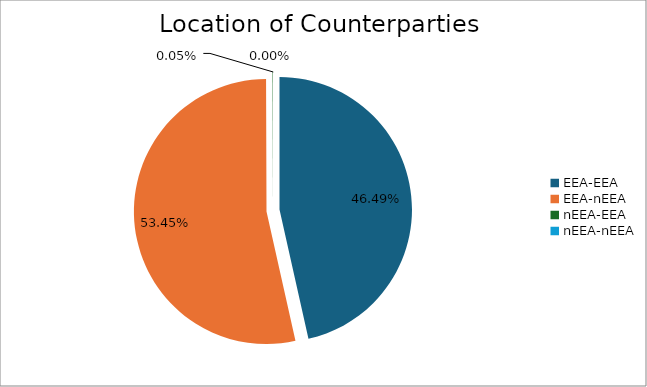
| Category | Series 0 |
|---|---|
| EEA-EEA | 6416100.86 |
| EEA-nEEA | 7376466.966 |
| nEEA-EEA | 7071.86 |
| nEEA-nEEA | 244.655 |